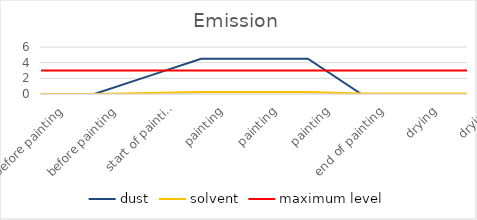
| Category | dust | solvent | maximum level |
|---|---|---|---|
| before painting | 0 | 0 | 3 |
| before painting | 0 | 0 | 3 |
| start of painting | 2.25 | 0.125 | 3 |
| painting | 4.5 | 0.25 | 3 |
| painting | 4.5 | 0.25 | 3 |
| painting | 4.5 | 0.25 | 3 |
| end of painting | 0 | 0.062 | 3 |
| drying | 0 | 0.062 | 3 |
| drying | 0 | 0.062 | 3 |